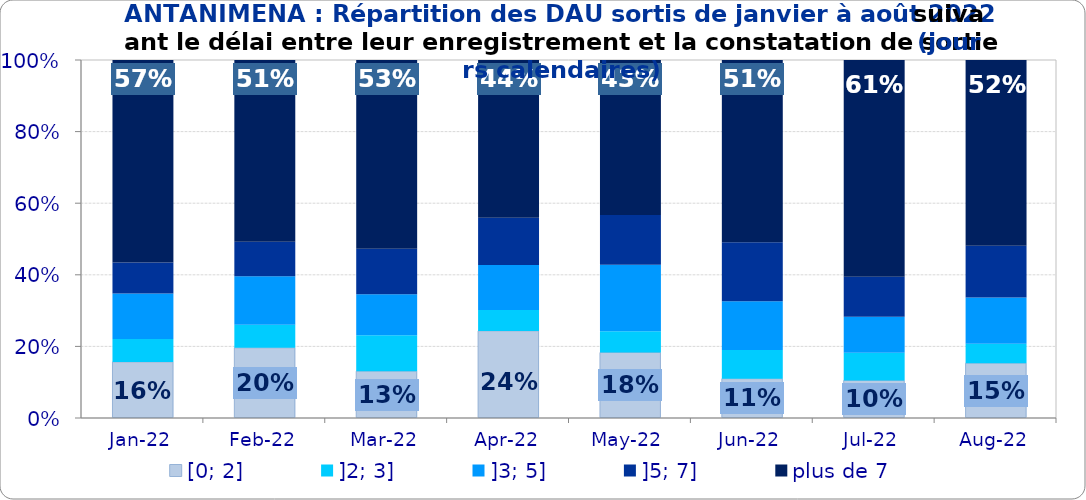
| Category | [0; 2] | ]2; 3] | ]3; 5] | ]5; 7] | plus de 7 |
|---|---|---|---|---|---|
| 2022-01-01 | 0.157 | 0.064 | 0.127 | 0.087 | 0.566 |
| 2022-02-01 | 0.196 | 0.065 | 0.136 | 0.096 | 0.508 |
| 2022-03-01 | 0.131 | 0.1 | 0.115 | 0.127 | 0.527 |
| 2022-04-01 | 0.243 | 0.058 | 0.126 | 0.132 | 0.441 |
| 2022-05-01 | 0.183 | 0.059 | 0.186 | 0.139 | 0.433 |
| 2022-06-01 | 0.11 | 0.08 | 0.136 | 0.165 | 0.509 |
| 2022-07-01 | 0.105 | 0.077 | 0.101 | 0.112 | 0.606 |
| 2022-08-01 | 0.153 | 0.054 | 0.13 | 0.145 | 0.519 |